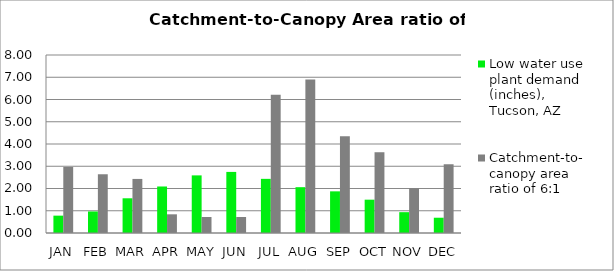
| Category | Low water use plant demand (inches), Tucson, AZ  | Catchment-to-canopy area ratio of 6:1  |
|---|---|---|
| JAN | 0.78 | 2.97 |
| FEB | 0.967 | 2.64 |
| MAR | 1.56 | 2.43 |
| APR | 2.09 | 0.84 |
| MAY | 2.59 | 0.72 |
| JUN | 2.746 | 0.72 |
| JUL | 2.434 | 6.21 |
| AUG | 2.059 | 6.9 |
| SEP | 1.872 | 4.35 |
| OCT | 1.498 | 3.63 |
| NOV | 0.936 | 2.01 |
| DEC | 0.686 | 3.09 |